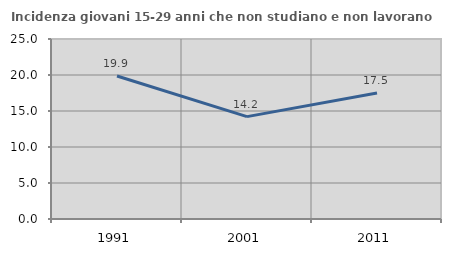
| Category | Incidenza giovani 15-29 anni che non studiano e non lavorano  |
|---|---|
| 1991.0 | 19.858 |
| 2001.0 | 14.218 |
| 2011.0 | 17.5 |